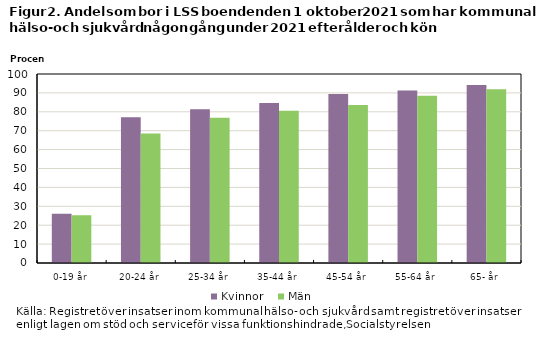
| Category | Kvinnor | Män |
|---|---|---|
| 0-19 år | 26 | 25.3 |
| 20-24 år | 77.1 | 68.5 |
| 25-34 år | 81.4 | 76.9 |
| 35-44 år | 84.7 | 80.5 |
| 45-54 år | 89.4 | 83.6 |
| 55-64 år | 91.3 | 88.5 |
| 65- år | 94.2 | 91.9 |